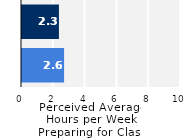
| Category | Series 0 |
|---|---|
| Upper Division | 2.647 |
| Lower Division | 2.323 |